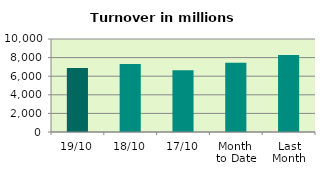
| Category | Series 0 |
|---|---|
| 19/10 | 6890.805 |
| 18/10 | 7299.573 |
| 17/10 | 6652.036 |
| Month 
to Date | 7434.026 |
| Last
Month | 8284.199 |